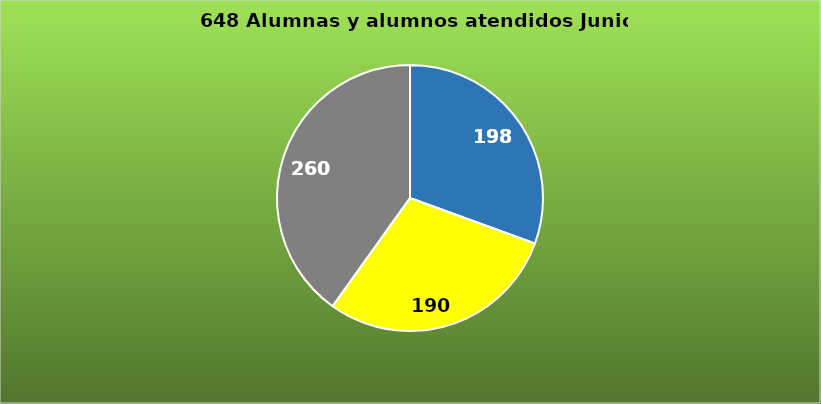
| Category | Series 0 |
|---|---|
| Base | 198 |
| Cooperación | 190 |
| Delegaciones | 260 |